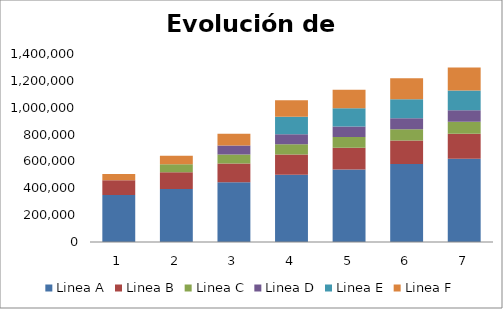
| Category | Linea A | Linea B | Linea C | Linea D | Linea E | Linea F |
|---|---|---|---|---|---|---|
| 0 | 350000 | 110000 | 0 | 0 | 0 | 46000 |
| 1 | 394625 | 124025 | 59962.5 | 0 | 0 | 63647.375 |
| 2 | 444939.688 | 139838.188 | 67607.719 | 66189.375 | 0 | 86947.571 |
| 3 | 501669.498 | 150500.849 | 76227.703 | 74628.52 | 129226.875 | 124082.934 |
| 4 | 539921.797 | 161976.539 | 80477.397 | 78024.118 | 135106.698 | 139127.018 |
| 5 | 581090.834 | 174327.25 | 84964.012 | 81574.215 | 141254.053 | 156018.413 |
| 6 | 619442.829 | 185832.849 | 89700.756 | 85285.842 | 147681.112 | 172138.215 |